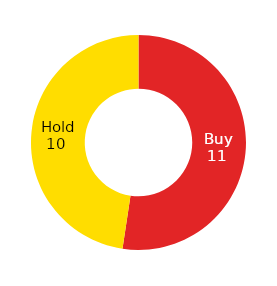
| Category | Series 0 |
|---|---|
| Buy | 11 |
| Hold | 10 |
| Sell | 0 |